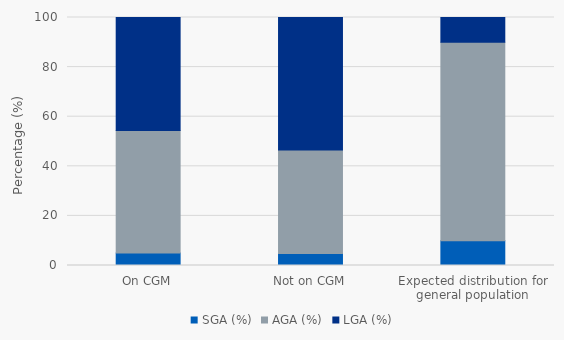
| Category | SGA (%) | AGA (%) | LGA (%) |
|---|---|---|---|
| On CGM | 5.085 | 49.364 | 45.551 |
| Not on CGM | 4.834 | 41.692 | 53.474 |
| Expected distribution for general population | 10 | 80 | 10 |